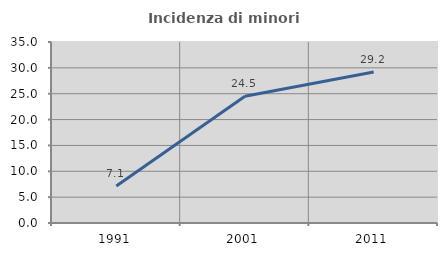
| Category | Incidenza di minori stranieri |
|---|---|
| 1991.0 | 7.143 |
| 2001.0 | 24.528 |
| 2011.0 | 29.215 |